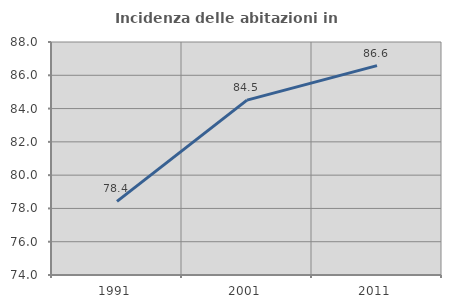
| Category | Incidenza delle abitazioni in proprietà  |
|---|---|
| 1991.0 | 78.428 |
| 2001.0 | 84.507 |
| 2011.0 | 86.578 |